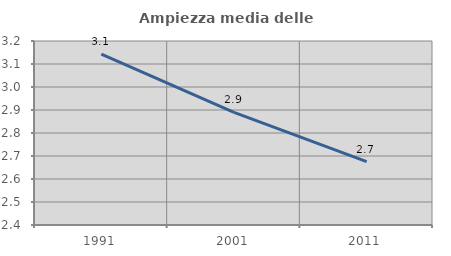
| Category | Ampiezza media delle famiglie |
|---|---|
| 1991.0 | 3.143 |
| 2001.0 | 2.89 |
| 2011.0 | 2.676 |